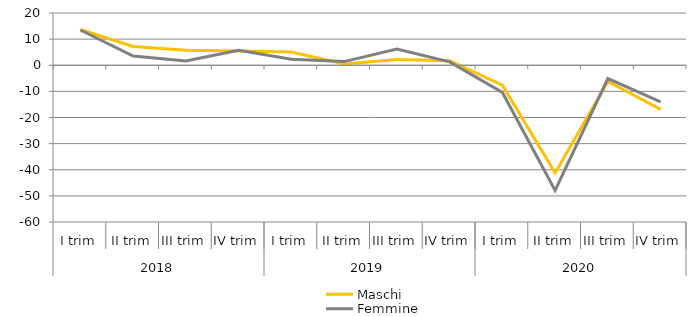
| Category | Maschi | Femmine |
|---|---|---|
| 0 | 13.7 | 13.5 |
| 1 | 7.2 | 3.5 |
| 2 | 5.7 | 1.6 |
| 3 | 5.5 | 5.7 |
| 4 | 5.1 | 2.3 |
| 5 | 0.5 | 1.4 |
| 6 | 2.2 | 6.2 |
| 7 | 1.7 | 1.3 |
| 8 | -7.6 | -10.4 |
| 9 | -41.2 | -47.9 |
| 10 | -6.2 | -5.1 |
| 11 | -16.9 | -14 |